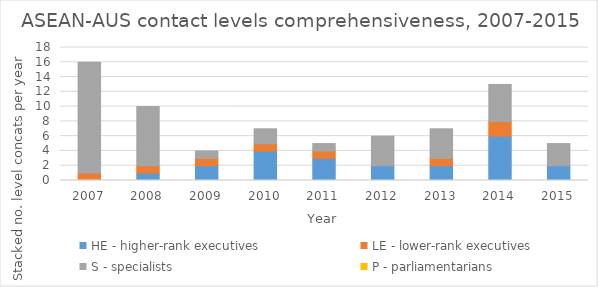
| Category | HE - higher-rank executives | LE - lower-rank executives | S - specialists | P - parliamentarians |
|---|---|---|---|---|
| 2007.0 | 0 | 1 | 15 | 0 |
| 2008.0 | 1 | 1 | 8 | 0 |
| 2009.0 | 2 | 1 | 1 | 0 |
| 2010.0 | 4 | 1 | 2 | 0 |
| 2011.0 | 3 | 1 | 1 | 0 |
| 2012.0 | 2 | 0 | 4 | 0 |
| 2013.0 | 2 | 1 | 4 | 0 |
| 2014.0 | 6 | 2 | 5 | 0 |
| 2015.0 | 2 | 0 | 3 | 0 |